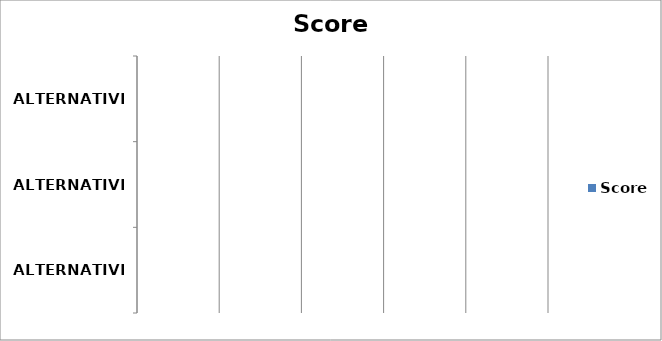
| Category | Score |
|---|---|
| ALTERNATIVE A | 0 |
| ALTERNATIVE B | 0 |
| ALTERNATIVE C | 0 |